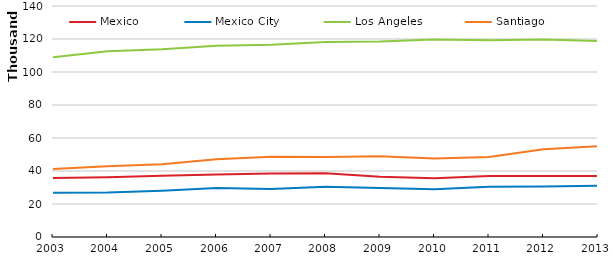
| Category | Mexico | Mexico City | Los Angeles | Santiago |
|---|---|---|---|---|
| 2003.0 | 35703.71 | 26824.71 | 108972.17 | 41213.71 |
| 2004.0 | 36202.51 | 27025.82 | 112533.07 | 42913.3 |
| 2005.0 | 37195.36 | 28105.66 | 113816.24 | 44075.86 |
| 2006.0 | 37897.25 | 29765.52 | 115858.11 | 47096.92 |
| 2007.0 | 38464.9 | 29093.01 | 116492.92 | 48660.83 |
| 2008.0 | 38626.54 | 30379.4 | 118226.55 | 48527.12 |
| 2009.0 | 36588.73 | 29671.48 | 118513.26 | 48997.5 |
| 2010.0 | 35600.97 | 28961.39 | 119625.84 | 47509.91 |
| 2011.0 | 36999.11 | 30490.13 | 119237.67 | 48428.49 |
| 2012.0 | 36980.42 | 30531.21 | 119667.38 | 53175.41 |
| 2013.0 | 36960.89 | 31114.01 | 118762.94 | 55017.12 |